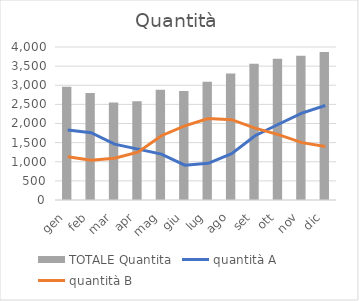
| Category | TOTALE Quantita |
|---|---|
| gen | 2960 |
| feb | 2800 |
| mar | 2550 |
| apr | 2580 |
| mag | 2880 |
| giu | 2850 |
| lug | 3090 |
| ago | 3310 |
| set | 3560 |
| ott | 3690 |
| nov | 3770 |
| dic | 3870 |